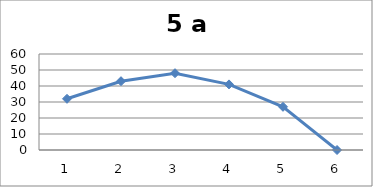
| Category | Series 0 |
|---|---|
| 0 | 32 |
| 1 | 43 |
| 2 | 48 |
| 3 | 41 |
| 4 | 27 |
| 5 | 0 |